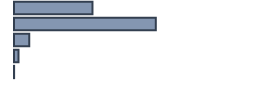
| Category | Percentatge |
|---|---|
| 0 | 32.696 |
| 1 | 59.087 |
| 2 | 6.304 |
| 3 | 1.87 |
| 4 | 0.043 |